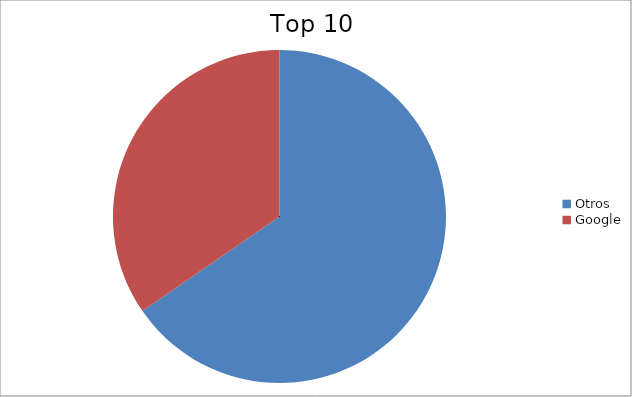
| Category | Series 0 |
|---|---|
| Otros | 65.38 |
| Google | 34.62 |